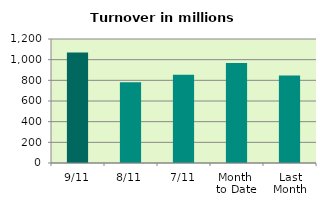
| Category | Series 0 |
|---|---|
| 9/11 | 1070.124 |
| 8/11 | 781.953 |
| 7/11 | 855.123 |
| Month 
to Date | 967.967 |
| Last
Month | 847.422 |